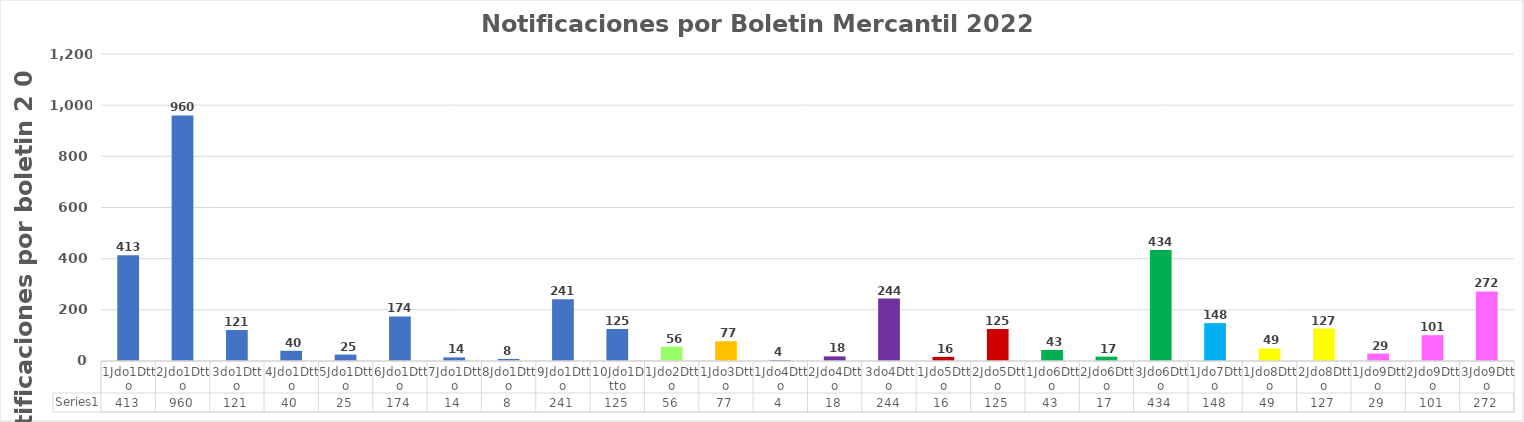
| Category | Series 0 |
|---|---|
| 1Jdo1Dtto | 413 |
| 2Jdo1Dtto | 960 |
| 3do1Dtto | 121 |
| 4Jdo1Dtto | 40 |
| 5Jdo1Dtto | 25 |
| 6Jdo1Dtto | 174 |
| 7Jdo1Dtto | 14 |
| 8Jdo1Dtto | 8 |
| 9Jdo1Dtto | 241 |
| 10Jdo1Dtto | 125 |
| 1Jdo2Dtto | 56 |
| 1Jdo3Dtto | 77 |
| 1Jdo4Dtto | 4 |
| 2Jdo4Dtto | 18 |
| 3do4Dtto | 244 |
| 1Jdo5Dtto | 16 |
| 2Jdo5Dtto | 125 |
| 1Jdo6Dtto | 43 |
| 2Jdo6Dtto | 17 |
| 3Jdo6Dtto | 434 |
| 1Jdo7Dtto | 148 |
| 1Jdo8Dtto | 49 |
| 2Jdo8Dtto | 127 |
| 1Jdo9Dtto | 29 |
| 2Jdo9Dtto | 101 |
| 3Jdo9Dtto | 272 |